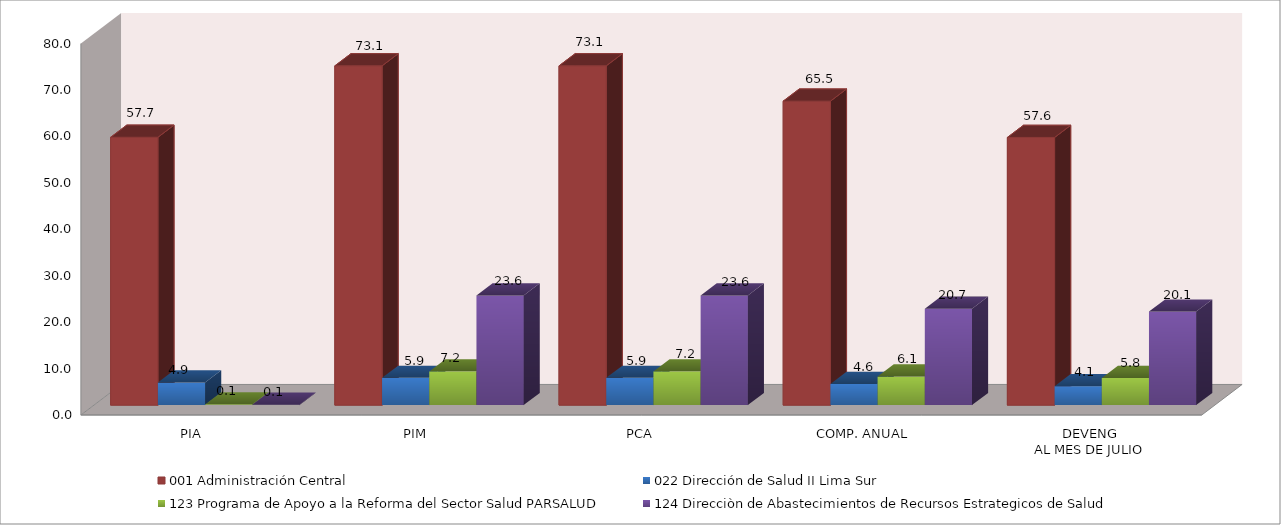
| Category | 001 Administración Central | 022 Dirección de Salud II Lima Sur | 123 Programa de Apoyo a la Reforma del Sector Salud PARSALUD | 124 Direcciòn de Abastecimientos de Recursos Estrategicos de Salud |
|---|---|---|---|---|
| PIA | 57.681 | 4.868 | 0.136 | 0.1 |
| PIM | 73.064 | 5.868 | 7.248 | 23.59 |
| PCA | 73.064 | 5.868 | 7.248 | 23.59 |
| COMP. ANUAL | 65.462 | 4.558 | 6.147 | 20.738 |
| DEVENG
AL MES DE JULIO | 57.646 | 4.051 | 5.839 | 20.138 |